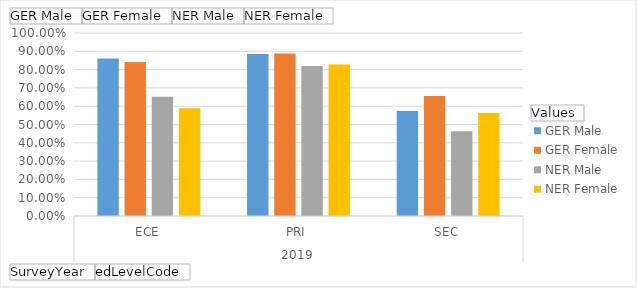
| Category | GER Male | GER Female | NER Male | NER Female |
|---|---|---|---|---|
| 0 | 0.86 | 0.841 | 0.651 | 0.589 |
| 1 | 0.885 | 0.888 | 0.82 | 0.828 |
| 2 | 0.573 | 0.656 | 0.463 | 0.563 |